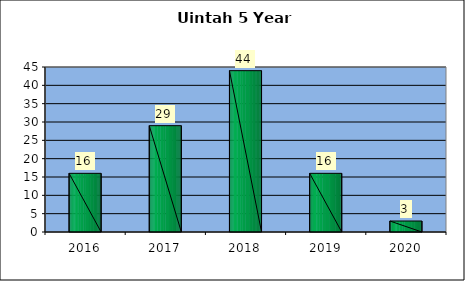
| Category | Washington Terrace March 5 Year Comparison |
|---|---|
| 0 | 16 |
| 1 | 29 |
| 2 | 44 |
| 3 | 16 |
| 4 | 3 |